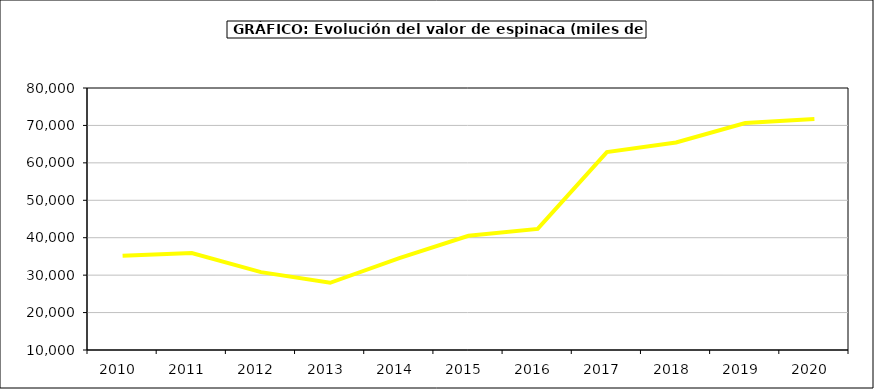
| Category | Valor |
|---|---|
| 2010.0 | 35154.695 |
| 2011.0 | 35899.468 |
| 2012.0 | 30801.916 |
| 2013.0 | 27951.792 |
| 2014.0 | 34558.726 |
| 2015.0 | 40502 |
| 2016.0 | 42355 |
| 2017.0 | 62868.236 |
| 2018.0 | 65435.978 |
| 2019.0 | 70628.986 |
| 2020.0 | 71691.2 |